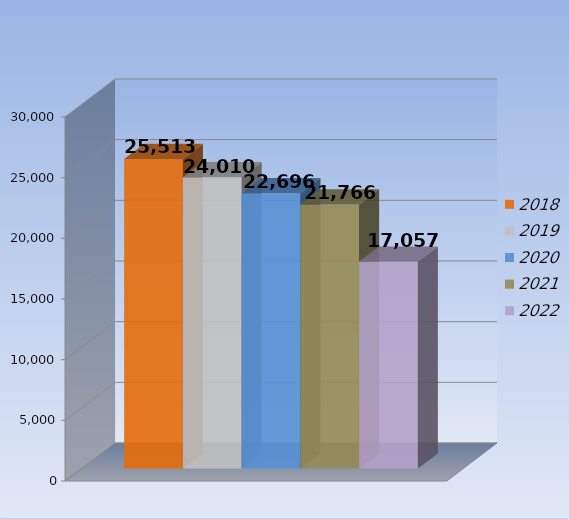
| Category | 2018 | 2019 | 2020 | 2021 | 2022 |
|---|---|---|---|---|---|
| 0 | 25513 | 24010 | 22696 | 21766 | 17057 |